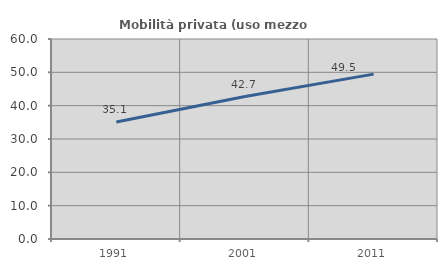
| Category | Mobilità privata (uso mezzo privato) |
|---|---|
| 1991.0 | 35.085 |
| 2001.0 | 42.73 |
| 2011.0 | 49.469 |